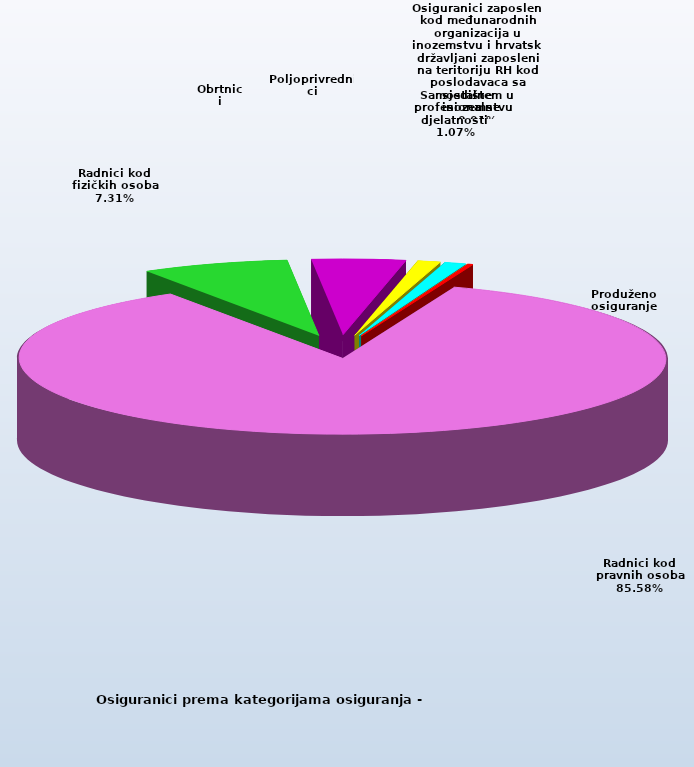
| Category | Series 0 |
|---|---|
| Radnici kod pravnih osoba | 1405660 |
| Radnici kod fizičkih osoba | 120069 |
| Obrtnici | 76484 |
| Poljoprivrednici | 18653 |
| Samostalne profesionalne djelatnosti  | 17576 |
| Osiguranici zaposleni kod međunarodnih organizacija u inozemstvu i hrvatski državljani zaposleni na teritoriju RH kod poslodavaca sa sjedištem u inozemstvu | 84 |
| Produženo osiguranje | 4025 |